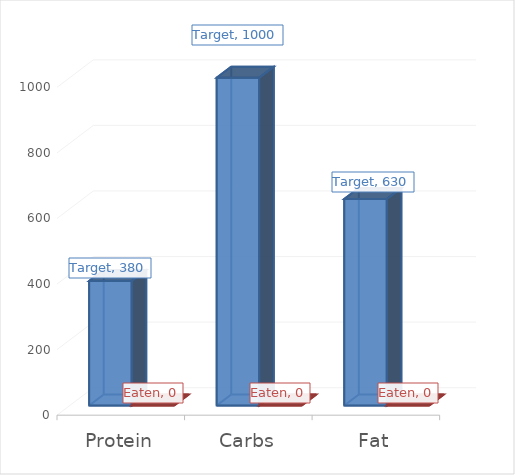
| Category | Target | Eaten |
|---|---|---|
| Protein | 380 | 0 |
| Carbs | 1000 | 0 |
| Fat | 630 | 0 |